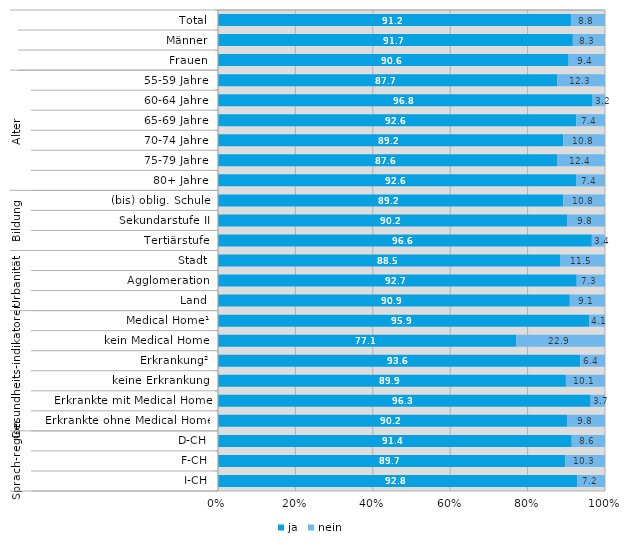
| Category | ja | nein |
|---|---|---|
| 0 | 91.2 | 8.8 |
| 1 | 91.7 | 8.3 |
| 2 | 90.6 | 9.4 |
| 3 | 87.7 | 12.3 |
| 4 | 96.8 | 3.2 |
| 5 | 92.6 | 7.4 |
| 6 | 89.2 | 10.8 |
| 7 | 87.6 | 12.4 |
| 8 | 92.6 | 7.4 |
| 9 | 89.2 | 10.8 |
| 10 | 90.2 | 9.8 |
| 11 | 96.6 | 3.4 |
| 12 | 88.5 | 11.5 |
| 13 | 92.7 | 7.3 |
| 14 | 90.9 | 9.1 |
| 15 | 95.9 | 4.1 |
| 16 | 77.1 | 22.9 |
| 17 | 93.6 | 6.4 |
| 18 | 89.9 | 10.1 |
| 19 | 96.3 | 3.7 |
| 20 | 90.2 | 9.8 |
| 21 | 91.4 | 8.6 |
| 22 | 89.7 | 10.3 |
| 23 | 92.8 | 7.2 |